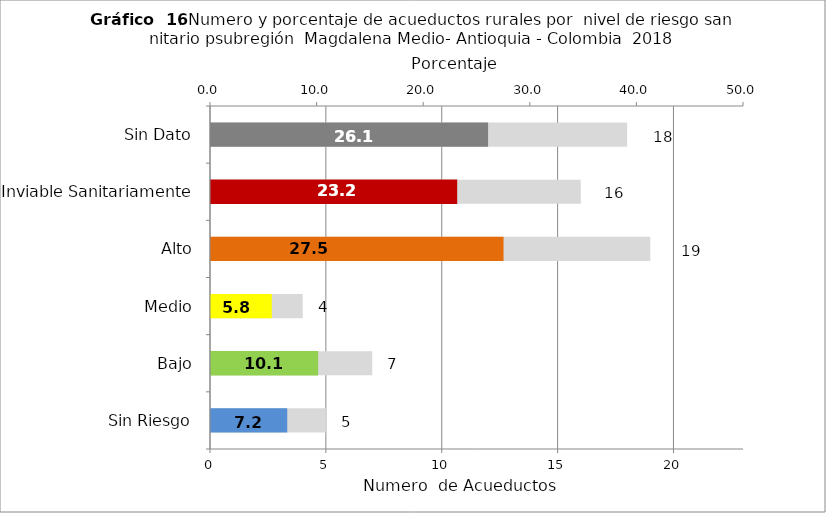
| Category | Número de Sistemas |
|---|---|
| Sin Riesgo | 5 |
| Bajo | 7 |
| Medio | 4 |
| Alto | 19 |
| Inviable Sanitariamente | 16 |
| Sin Dato | 18 |